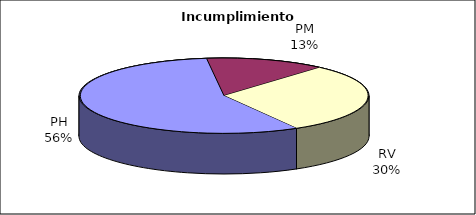
| Category | Valores |
|---|---|
| PH | 273 |
| PM | 65 |
| RV | 146 |